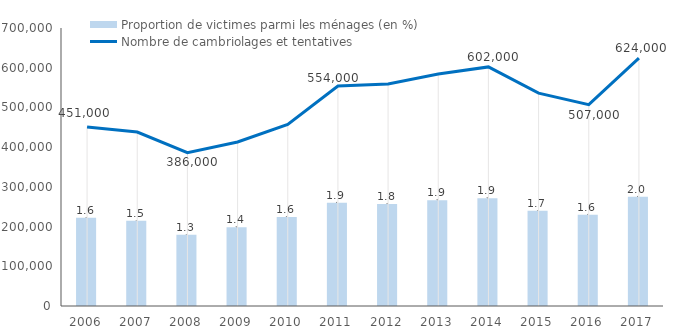
| Category | Proportion de victimes parmi les ménages (en %) |
|---|---|
| 2006.0 | 1.587 |
| 2007.0 | 1.535 |
| 2008.0 | 1.282 |
| 2009.0 | 1.415 |
| 2010.0 | 1.602 |
| 2011.0 | 1.856 |
| 2012.0 | 1.834 |
| 2013.0 | 1.902 |
| 2014.0 | 1.937 |
| 2015.0 | 1.715 |
| 2016.0 | 1.643 |
| 2017.0 | 1.964 |